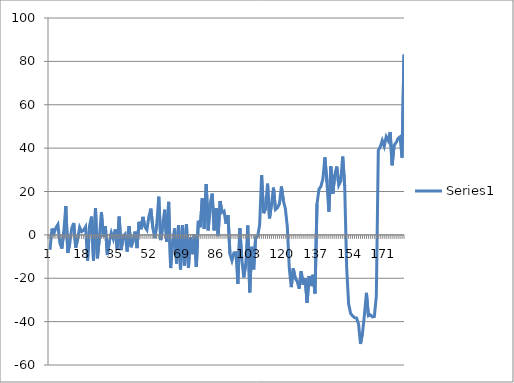
| Category | Series 0 |
|---|---|
| 0 | -6.9 |
| 1 | 2.9 |
| 2 | 0.7 |
| 3 | 3.3 |
| 4 | 4.8 |
| 5 | -3.8 |
| 6 | -6.3 |
| 7 | 1.6 |
| 8 | 13.3 |
| 9 | -8.3 |
| 10 | -4 |
| 11 | 3.1 |
| 12 | 5.5 |
| 13 | -5.9 |
| 14 | -1.8 |
| 15 | 3.5 |
| 16 | 1.5 |
| 17 | 2.1 |
| 18 | 3.7 |
| 19 | -11.9 |
| 20 | 4.1 |
| 21 | 8.4 |
| 22 | -11.8 |
| 23 | 12.3 |
| 24 | -10.8 |
| 25 | -1.1 |
| 26 | 10.5 |
| 27 | -0.8 |
| 28 | 4 |
| 29 | -9.3 |
| 30 | -3.2 |
| 31 | 1 |
| 32 | -1.8 |
| 33 | 2.5 |
| 34 | -6.6 |
| 35 | 8.4 |
| 36 | -7 |
| 37 | -0.6 |
| 38 | 0.4 |
| 39 | -7.7 |
| 40 | 4 |
| 41 | -5.7 |
| 42 | -2.4 |
| 43 | 1.5 |
| 44 | -6.1 |
| 45 | 6 |
| 46 | 2.6 |
| 47 | 8.3 |
| 48 | 3.7 |
| 49 | 2.3 |
| 50 | 8.4 |
| 51 | 12.1 |
| 52 | 3.2 |
| 53 | -1.5 |
| 54 | 4.9 |
| 55 | 17.6 |
| 56 | -2.4 |
| 57 | 4.1 |
| 58 | 11.6 |
| 59 | -3.3 |
| 60 | 15.2 |
| 61 | -15.3 |
| 62 | -3.5 |
| 63 | 3 |
| 64 | -13.2 |
| 65 | 4.5 |
| 66 | -15.9 |
| 67 | 4.5 |
| 68 | -14.1 |
| 69 | 5 |
| 70 | -15.1 |
| 71 | -1.1 |
| 72 | -8.9 |
| 73 | 0.4 |
| 74 | -14.8 |
| 75 | 6.5 |
| 76 | 3.5 |
| 77 | 16.9 |
| 78 | 2.7 |
| 79 | 23.4 |
| 80 | 2.1 |
| 81 | 14.3 |
| 82 | 19 |
| 83 | 2.1 |
| 84 | 12.4 |
| 85 | -0.6 |
| 86 | 15.6 |
| 87 | 10.4 |
| 88 | 11 |
| 89 | 5.1 |
| 90 | 9.1 |
| 91 | -8.8 |
| 92 | -11.9 |
| 93 | -8.3 |
| 94 | -8.2 |
| 95 | -22.6 |
| 96 | 3 |
| 97 | -11.4 |
| 98 | -19.6 |
| 99 | -13.3 |
| 100 | 4.3 |
| 101 | -26.5 |
| 102 | -5.5 |
| 103 | -15.9 |
| 104 | -0.8 |
| 105 | -0.6 |
| 106 | 4.5 |
| 107 | 27.6 |
| 108 | 10 |
| 109 | 12.1 |
| 110 | 23.6 |
| 111 | 7.6 |
| 112 | 14.1 |
| 113 | 21.8 |
| 114 | 11.7 |
| 115 | 12.5 |
| 116 | 14.3 |
| 117 | 22.3 |
| 118 | 15.7 |
| 119 | 12.2 |
| 120 | 3.8 |
| 121 | -15.5 |
| 122 | -24.1 |
| 123 | -15.5 |
| 124 | -20 |
| 125 | -21.5 |
| 126 | -24.8 |
| 127 | -16.8 |
| 128 | -22.9 |
| 129 | -19.9 |
| 130 | -31.3 |
| 131 | -19 |
| 132 | -23.6 |
| 133 | -18.4 |
| 134 | -27 |
| 135 | 14.2 |
| 136 | 21 |
| 137 | 22.4 |
| 138 | 25.9 |
| 139 | 35.7 |
| 140 | 24.4 |
| 141 | 10.7 |
| 142 | 31.6 |
| 143 | 18.9 |
| 144 | 27.7 |
| 145 | 31.5 |
| 146 | 22.9 |
| 147 | 24.8 |
| 148 | 36.1 |
| 149 | 22.6 |
| 150 | -15 |
| 151 | -31.9 |
| 152 | -36.2 |
| 153 | -37.4 |
| 154 | -38.2 |
| 155 | -38.4 |
| 156 | -41 |
| 157 | -50.3 |
| 158 | -45.3 |
| 159 | -36.8 |
| 160 | -26.7 |
| 161 | -37.3 |
| 162 | -36.9 |
| 163 | -37.8 |
| 164 | -37.6 |
| 165 | -28.2 |
| 166 | 39 |
| 167 | 40.6 |
| 168 | 43.6 |
| 169 | 40.9 |
| 170 | 45.3 |
| 171 | 43.5 |
| 172 | 47.4 |
| 173 | 32.1 |
| 174 | 41.4 |
| 175 | 42.5 |
| 176 | 44.5 |
| 177 | 45.2 |
| 178 | 35.6 |
| 179 | 83.2 |